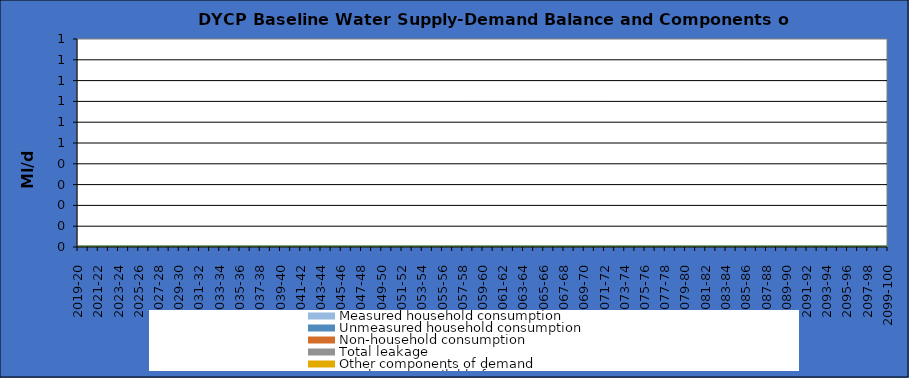
| Category | Total water available for use | Total demand + target headroom (baseline) |
|---|---|---|
| 0 | 0 | 0 |
| 1 | 0 | 0 |
| 2 | 0 | 0 |
| 3 | 0 | 0 |
| 4 | 0 | 0 |
| 5 | 0 | 0 |
| 6 | 0 | 0 |
| 7 | 0 | 0 |
| 8 | 0 | 0 |
| 9 | 0 | 0 |
| 10 | 0 | 0 |
| 11 | 0 | 0 |
| 12 | 0 | 0 |
| 13 | 0 | 0 |
| 14 | 0 | 0 |
| 15 | 0 | 0 |
| 16 | 0 | 0 |
| 17 | 0 | 0 |
| 18 | 0 | 0 |
| 19 | 0 | 0 |
| 20 | 0 | 0 |
| 21 | 0 | 0 |
| 22 | 0 | 0 |
| 23 | 0 | 0 |
| 24 | 0 | 0 |
| 25 | 0 | 0 |
| 26 | 0 | 0 |
| 27 | 0 | 0 |
| 28 | 0 | 0 |
| 29 | 0 | 0 |
| 30 | 0 | 0 |
| 31 | 0 | 0 |
| 32 | 0 | 0 |
| 33 | 0 | 0 |
| 34 | 0 | 0 |
| 35 | 0 | 0 |
| 36 | 0 | 0 |
| 37 | 0 | 0 |
| 38 | 0 | 0 |
| 39 | 0 | 0 |
| 40 | 0 | 0 |
| 41 | 0 | 0 |
| 42 | 0 | 0 |
| 43 | 0 | 0 |
| 44 | 0 | 0 |
| 45 | 0 | 0 |
| 46 | 0 | 0 |
| 47 | 0 | 0 |
| 48 | 0 | 0 |
| 49 | 0 | 0 |
| 50 | 0 | 0 |
| 51 | 0 | 0 |
| 52 | 0 | 0 |
| 53 | 0 | 0 |
| 54 | 0 | 0 |
| 55 | 0 | 0 |
| 56 | 0 | 0 |
| 57 | 0 | 0 |
| 58 | 0 | 0 |
| 59 | 0 | 0 |
| 60 | 0 | 0 |
| 61 | 0 | 0 |
| 62 | 0 | 0 |
| 63 | 0 | 0 |
| 64 | 0 | 0 |
| 65 | 0 | 0 |
| 66 | 0 | 0 |
| 67 | 0 | 0 |
| 68 | 0 | 0 |
| 69 | 0 | 0 |
| 70 | 0 | 0 |
| 71 | 0 | 0 |
| 72 | 0 | 0 |
| 73 | 0 | 0 |
| 74 | 0 | 0 |
| 75 | 0 | 0 |
| 76 | 0 | 0 |
| 77 | 0 | 0 |
| 78 | 0 | 0 |
| 79 | 0 | 0 |
| 80 | 0 | 0 |